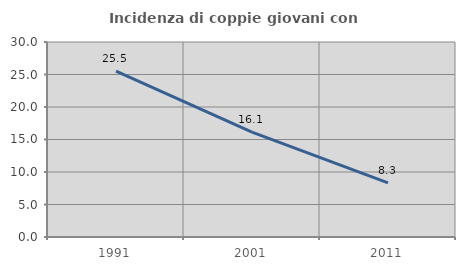
| Category | Incidenza di coppie giovani con figli |
|---|---|
| 1991.0 | 25.537 |
| 2001.0 | 16.129 |
| 2011.0 | 8.313 |